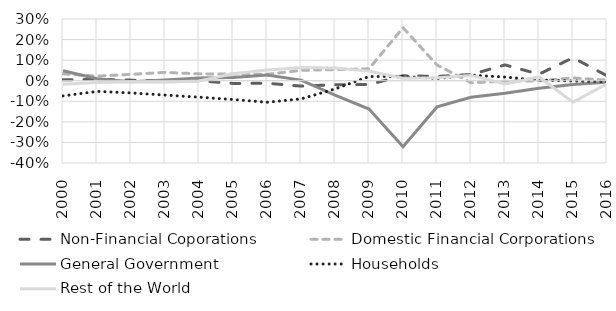
| Category | Non-Financial Coporations | Domestic Financial Corporations | General Government | Households | Rest of the World |
|---|---|---|---|---|---|
| 2000 | 0.004 | 0.033 | 0.049 | -0.074 | -0.017 |
| 2001 | 0.007 | 0.022 | 0.01 | -0.052 | -0.008 |
| 2002 | 0.003 | 0.031 | -0.005 | -0.059 | -0.006 |
| 2003 | 0 | 0.04 | 0.004 | -0.07 | -0.007 |
| 2004 | 0 | 0.033 | 0.013 | -0.08 | -0.001 |
| 2005 | -0.013 | 0.032 | 0.016 | -0.091 | 0.034 |
| 2006 | -0.012 | 0.031 | 0.028 | -0.105 | 0.052 |
| 2007 | -0.026 | 0.05 | 0.003 | -0.088 | 0.064 |
| 2008 | -0.02 | 0.054 | -0.07 | -0.04 | 0.062 |
| 2009 | -0.019 | 0.058 | -0.138 | 0.02 | 0.047 |
| 2010 | 0.024 | 0.258 | -0.32 | 0.021 | 0.012 |
| 2011 | 0.021 | 0.076 | -0.127 | 0.011 | 0.014 |
| 2012 | 0.03 | -0.01 | -0.08 | 0.027 | 0.026 |
| 2013 | 0.077 | -0.002 | -0.061 | 0.018 | -0.016 |
| 2014 | 0.032 | 0 | -0.036 | 0.003 | 0.018 |
| 2015 | 0.112 | 0.014 | -0.019 | -0.001 | -0.104 |
| 2016 | 0.024 | 0.002 | -0.007 | -0.005 | -0.015 |